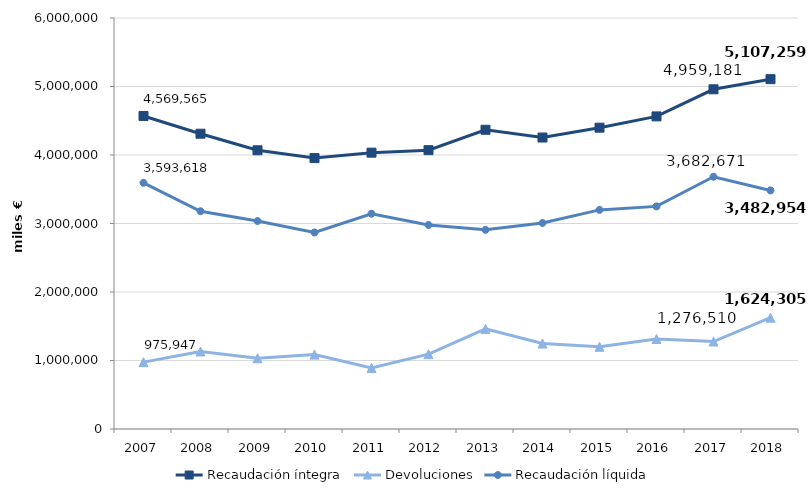
| Category | Recaudación íntegra | Devoluciones | Recaudación líquida |
|---|---|---|---|
| 2007.0 | 4569564.694 | 975947.184 | 3593617.511 |
| 2008.0 | 4310607.817 | 1131418.411 | 3179189.405 |
| 2009.0 | 4068712.882 | 1032557.036 | 3036155.845 |
| 2010.0 | 3954897.595 | 1085991.918 | 2868905.677 |
| 2011.0 | 4034191.014 | 891687.288 | 3142503.727 |
| 2012.0 | 4070844.381 | 1092254.555 | 2978589.826 |
| 2013.0 | 4368385.495 | 1461255.497 | 2907129.998 |
| 2014.0 | 4255033.664 | 1247467.968 | 3007565.696 |
| 2015.0 | 4398741.824 | 1200312.032 | 3198429.792 |
| 2016.0 | 4563540.838 | 1313808.981 | 3249731.857 |
| 2017.0 | 4959181.282 | 1276510.17 | 3682671.113 |
| 2018.0 | 5107259.058 | 1624305.468 | 3482953.59 |